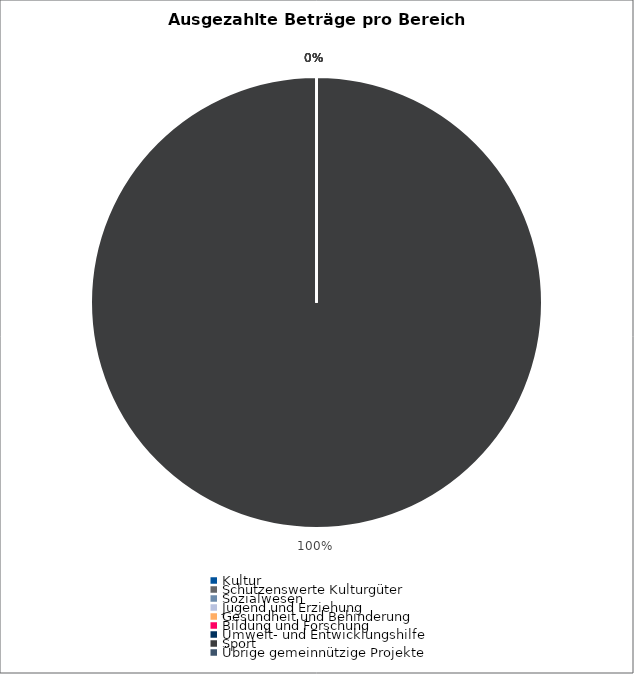
| Category | Series 0 |
|---|---|
| Kultur | 0 |
| Schützenswerte Kulturgüter | 0 |
| Sozialwesen | 0 |
| Jugend und Erziehung | 0 |
| Gesundheit und Behinderung | 0 |
| Bildung und Forschung | 0 |
| Umwelt- und Entwicklungshilfe | 0 |
| Sport | 2058096 |
| Übrige gemeinnützige Projekte | 0 |